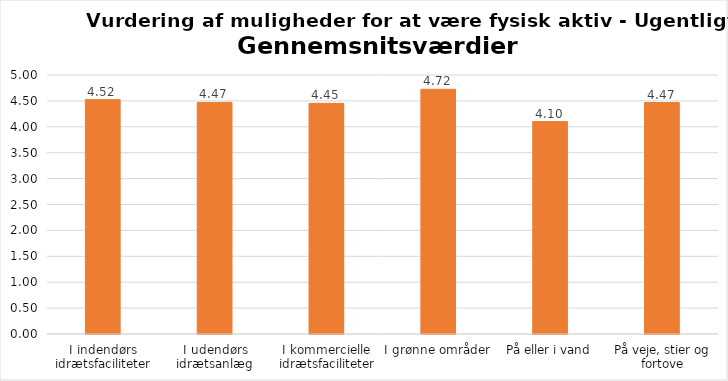
| Category | Gennemsnit |
|---|---|
| I indendørs idrætsfaciliteter | 4.525 |
| I udendørs idrætsanlæg | 4.471 |
| I kommercielle idrætsfaciliteter | 4.452 |
| I grønne områder | 4.725 |
| På eller i vand | 4.101 |
| På veje, stier og fortove | 4.469 |